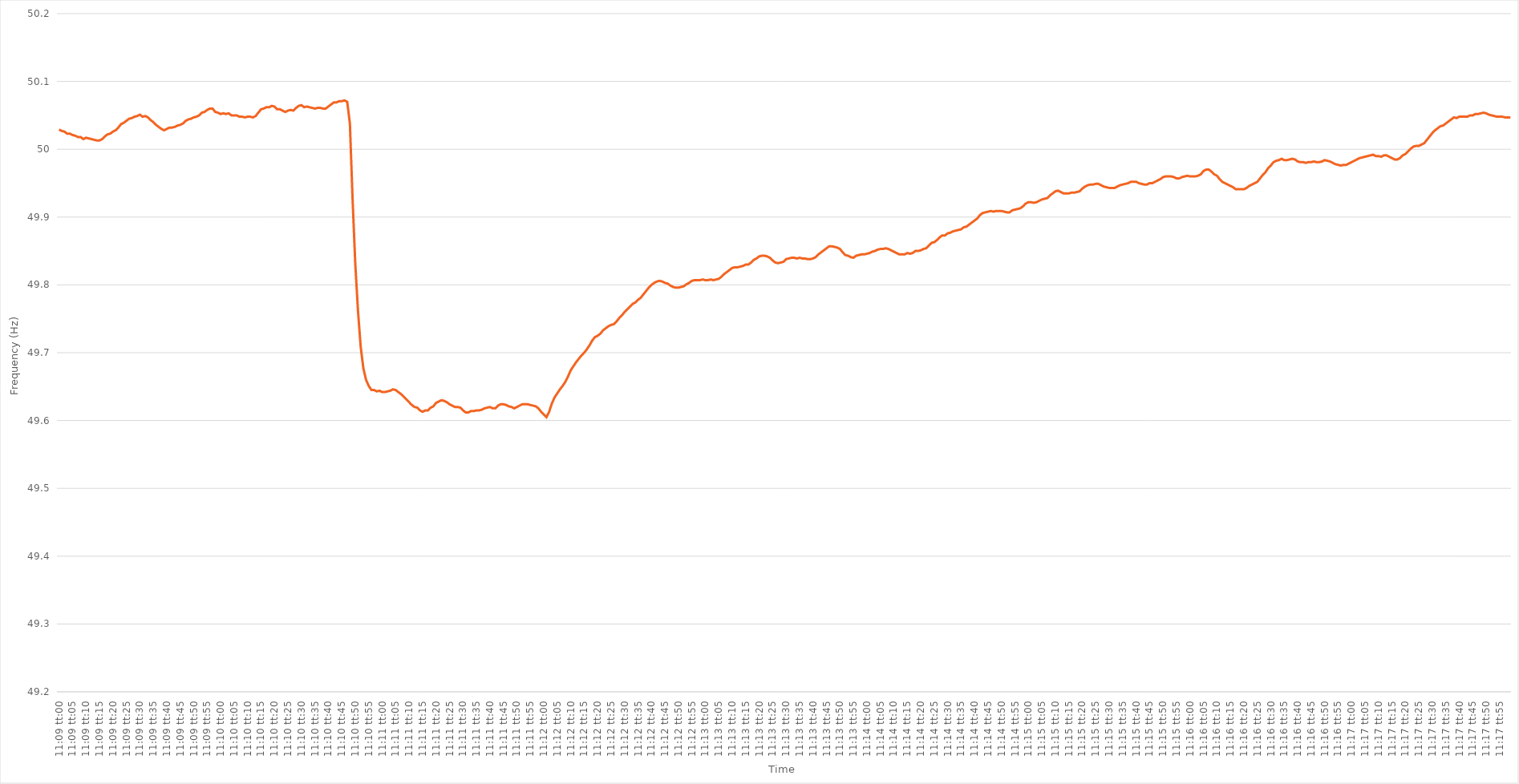
| Category | Series 0 |
|---|---|
| 0.46458333333333335 | 50.029 |
| 0.4645949074074074 | 50.027 |
| 0.4646064814814815 | 50.026 |
| 0.4646180555555555 | 50.023 |
| 0.46462962962962967 | 50.023 |
| 0.4646412037037037 | 50.021 |
| 0.4646527777777778 | 50.02 |
| 0.46466435185185184 | 50.018 |
| 0.46467592592592594 | 50.018 |
| 0.4646875 | 50.015 |
| 0.4646990740740741 | 50.017 |
| 0.46471064814814816 | 50.016 |
| 0.4647222222222222 | 50.015 |
| 0.4647337962962963 | 50.014 |
| 0.46474537037037034 | 50.013 |
| 0.46475694444444443 | 50.013 |
| 0.46476851851851847 | 50.015 |
| 0.4647800925925926 | 50.019 |
| 0.46479166666666666 | 50.022 |
| 0.46480324074074075 | 50.023 |
| 0.4648148148148148 | 50.026 |
| 0.4648263888888889 | 50.028 |
| 0.4648379629629629 | 50.032 |
| 0.4648495370370371 | 50.037 |
| 0.4648611111111111 | 50.039 |
| 0.4648726851851852 | 50.042 |
| 0.46488425925925925 | 50.045 |
| 0.46489583333333334 | 50.046 |
| 0.4649074074074074 | 50.048 |
| 0.46491898148148153 | 50.049 |
| 0.46493055555555557 | 50.051 |
| 0.46494212962962966 | 50.048 |
| 0.4649537037037037 | 50.049 |
| 0.4649652777777778 | 50.047 |
| 0.46497685185185184 | 50.043 |
| 0.4649884259259259 | 50.04 |
| 0.465 | 50.036 |
| 0.46501157407407406 | 50.033 |
| 0.46502314814814816 | 50.03 |
| 0.4650347222222222 | 50.028 |
| 0.4650462962962963 | 50.03 |
| 0.46505787037037033 | 50.032 |
| 0.4650694444444445 | 50.032 |
| 0.4650810185185185 | 50.033 |
| 0.4650925925925926 | 50.035 |
| 0.46510416666666665 | 50.036 |
| 0.46511574074074075 | 50.038 |
| 0.4651273148148148 | 50.042 |
| 0.46513888888888894 | 50.044 |
| 0.465150462962963 | 50.045 |
| 0.46516203703703707 | 50.047 |
| 0.4651736111111111 | 50.048 |
| 0.4651851851851852 | 50.05 |
| 0.46519675925925924 | 50.054 |
| 0.4652083333333333 | 50.055 |
| 0.46521990740740743 | 50.058 |
| 0.46523148148148147 | 50.06 |
| 0.46524305555555556 | 50.06 |
| 0.4652546296296296 | 50.055 |
| 0.4652662037037037 | 50.054 |
| 0.46527777777777773 | 50.052 |
| 0.4652893518518519 | 50.053 |
| 0.4653009259259259 | 50.052 |
| 0.4653125 | 50.053 |
| 0.46532407407407406 | 50.05 |
| 0.46533564814814815 | 50.05 |
| 0.4653472222222222 | 50.05 |
| 0.46535879629629634 | 50.048 |
| 0.4653703703703704 | 50.048 |
| 0.4653819444444445 | 50.047 |
| 0.4653935185185185 | 50.048 |
| 0.4654050925925926 | 50.048 |
| 0.46541666666666665 | 50.047 |
| 0.4654282407407408 | 50.049 |
| 0.46543981481481483 | 50.054 |
| 0.4654513888888889 | 50.059 |
| 0.46546296296296297 | 50.06 |
| 0.465474537037037 | 50.062 |
| 0.4654861111111111 | 50.062 |
| 0.46549768518518514 | 50.064 |
| 0.4655092592592593 | 50.063 |
| 0.46552083333333333 | 50.059 |
| 0.4655324074074074 | 50.059 |
| 0.46554398148148146 | 50.057 |
| 0.46555555555555556 | 50.055 |
| 0.4655671296296296 | 50.057 |
| 0.46557870370370374 | 50.058 |
| 0.4655902777777778 | 50.057 |
| 0.4656018518518519 | 50.061 |
| 0.4656134259259259 | 50.064 |
| 0.465625 | 50.065 |
| 0.46563657407407405 | 50.062 |
| 0.4656481481481482 | 50.063 |
| 0.46565972222222224 | 50.062 |
| 0.46567129629629633 | 50.061 |
| 0.46568287037037037 | 50.06 |
| 0.4656944444444444 | 50.061 |
| 0.4657060185185185 | 50.061 |
| 0.46571759259259254 | 50.06 |
| 0.4657291666666667 | 50.06 |
| 0.46574074074074073 | 50.063 |
| 0.4657523148148148 | 50.066 |
| 0.46576388888888887 | 50.069 |
| 0.46577546296296296 | 50.069 |
| 0.465787037037037 | 50.071 |
| 0.46579861111111115 | 50.071 |
| 0.4658101851851852 | 50.072 |
| 0.4658217592592593 | 50.07 |
| 0.4658333333333333 | 50.038 |
| 0.4658449074074074 | 49.926 |
| 0.46585648148148145 | 49.831 |
| 0.4658680555555556 | 49.762 |
| 0.46587962962962964 | 49.709 |
| 0.46589120370370374 | 49.677 |
| 0.4659027777777778 | 49.66 |
| 0.4659143518518518 | 49.651 |
| 0.4659259259259259 | 49.645 |
| 0.46593749999999995 | 49.645 |
| 0.4659490740740741 | 49.643 |
| 0.46596064814814814 | 49.644 |
| 0.46597222222222223 | 49.642 |
| 0.46598379629629627 | 49.642 |
| 0.46599537037037037 | 49.643 |
| 0.4660069444444444 | 49.644 |
| 0.46601851851851855 | 49.646 |
| 0.4660300925925926 | 49.645 |
| 0.4660416666666667 | 49.642 |
| 0.4660532407407407 | 49.639 |
| 0.4660648148148148 | 49.635 |
| 0.46607638888888886 | 49.631 |
| 0.466087962962963 | 49.627 |
| 0.46609953703703705 | 49.623 |
| 0.46611111111111114 | 49.62 |
| 0.4661226851851852 | 49.619 |
| 0.4661342592592593 | 49.615 |
| 0.4661458333333333 | 49.613 |
| 0.46615740740740735 | 49.615 |
| 0.4661689814814815 | 49.615 |
| 0.46618055555555554 | 49.619 |
| 0.46619212962962964 | 49.621 |
| 0.4662037037037037 | 49.626 |
| 0.46621527777777777 | 49.628 |
| 0.4662268518518518 | 49.63 |
| 0.46623842592592596 | 49.629 |
| 0.46625 | 49.627 |
| 0.4662615740740741 | 49.624 |
| 0.46627314814814813 | 49.622 |
| 0.4662847222222222 | 49.62 |
| 0.46629629629629626 | 49.62 |
| 0.4663078703703704 | 49.619 |
| 0.46631944444444445 | 49.615 |
| 0.46633101851851855 | 49.612 |
| 0.4663425925925926 | 49.612 |
| 0.4663541666666667 | 49.614 |
| 0.4663657407407407 | 49.614 |
| 0.46637731481481487 | 49.615 |
| 0.4663888888888889 | 49.615 |
| 0.46640046296296295 | 49.616 |
| 0.46641203703703704 | 49.618 |
| 0.4664236111111111 | 49.619 |
| 0.4664351851851852 | 49.62 |
| 0.4664467592592592 | 49.618 |
| 0.46645833333333336 | 49.618 |
| 0.4664699074074074 | 49.622 |
| 0.4664814814814815 | 49.624 |
| 0.46649305555555554 | 49.624 |
| 0.46650462962962963 | 49.623 |
| 0.46651620370370367 | 49.621 |
| 0.4665277777777778 | 49.62 |
| 0.46653935185185186 | 49.618 |
| 0.46655092592592595 | 49.62 |
| 0.4665625 | 49.622 |
| 0.4665740740740741 | 49.624 |
| 0.4665856481481481 | 49.624 |
| 0.4665972222222223 | 49.624 |
| 0.4666087962962963 | 49.623 |
| 0.46662037037037035 | 49.622 |
| 0.46663194444444445 | 49.621 |
| 0.4666435185185185 | 49.618 |
| 0.4666550925925926 | 49.613 |
| 0.4666666666666666 | 49.609 |
| 0.46667824074074077 | 49.605 |
| 0.4666898148148148 | 49.613 |
| 0.4667013888888889 | 49.625 |
| 0.46671296296296294 | 49.634 |
| 0.46672453703703703 | 49.64 |
| 0.4667361111111111 | 49.646 |
| 0.4667476851851852 | 49.651 |
| 0.46675925925925926 | 49.657 |
| 0.46677083333333336 | 49.665 |
| 0.4667824074074074 | 49.674 |
| 0.4667939814814815 | 49.68 |
| 0.46680555555555553 | 49.686 |
| 0.4668171296296297 | 49.691 |
| 0.4668287037037037 | 49.696 |
| 0.4668402777777778 | 49.7 |
| 0.46685185185185185 | 49.705 |
| 0.4668634259259259 | 49.711 |
| 0.466875 | 49.718 |
| 0.466886574074074 | 49.723 |
| 0.4668981481481482 | 49.725 |
| 0.4669097222222222 | 49.728 |
| 0.4669212962962963 | 49.733 |
| 0.46693287037037035 | 49.736 |
| 0.46694444444444444 | 49.739 |
| 0.4669560185185185 | 49.741 |
| 0.46696759259259263 | 49.742 |
| 0.46697916666666667 | 49.746 |
| 0.46699074074074076 | 49.751 |
| 0.4670023148148148 | 49.755 |
| 0.4670138888888889 | 49.76 |
| 0.46702546296296293 | 49.764 |
| 0.4670370370370371 | 49.768 |
| 0.4670486111111111 | 49.772 |
| 0.4670601851851852 | 49.774 |
| 0.46707175925925926 | 49.778 |
| 0.46708333333333335 | 49.781 |
| 0.4670949074074074 | 49.786 |
| 0.46710648148148143 | 49.791 |
| 0.4671180555555556 | 49.796 |
| 0.4671296296296296 | 49.8 |
| 0.4671412037037037 | 49.803 |
| 0.46715277777777775 | 49.805 |
| 0.46716435185185184 | 49.806 |
| 0.4671759259259259 | 49.805 |
| 0.46718750000000003 | 49.803 |
| 0.46719907407407407 | 49.802 |
| 0.46721064814814817 | 49.799 |
| 0.4672222222222222 | 49.797 |
| 0.4672337962962963 | 49.796 |
| 0.46724537037037034 | 49.796 |
| 0.4672569444444445 | 49.797 |
| 0.4672685185185185 | 49.798 |
| 0.4672800925925926 | 49.801 |
| 0.46729166666666666 | 49.803 |
| 0.46730324074074076 | 49.806 |
| 0.4673148148148148 | 49.807 |
| 0.46732638888888883 | 49.807 |
| 0.467337962962963 | 49.807 |
| 0.467349537037037 | 49.808 |
| 0.4673611111111111 | 49.807 |
| 0.46737268518518515 | 49.807 |
| 0.46738425925925925 | 49.808 |
| 0.4673958333333333 | 49.807 |
| 0.46740740740740744 | 49.808 |
| 0.4674189814814815 | 49.809 |
| 0.46743055555555557 | 49.812 |
| 0.4674421296296296 | 49.816 |
| 0.4674537037037037 | 49.819 |
| 0.46746527777777774 | 49.822 |
| 0.4674768518518519 | 49.825 |
| 0.46748842592592593 | 49.826 |
| 0.4675 | 49.826 |
| 0.46751157407407407 | 49.827 |
| 0.46752314814814816 | 49.828 |
| 0.4675347222222222 | 49.83 |
| 0.46754629629629635 | 49.83 |
| 0.4675578703703704 | 49.833 |
| 0.4675694444444445 | 49.837 |
| 0.4675810185185185 | 49.839 |
| 0.46759259259259256 | 49.842 |
| 0.46760416666666665 | 49.843 |
| 0.4676157407407407 | 49.843 |
| 0.46762731481481484 | 49.842 |
| 0.4676388888888889 | 49.84 |
| 0.467650462962963 | 49.836 |
| 0.467662037037037 | 49.833 |
| 0.4676736111111111 | 49.832 |
| 0.46768518518518515 | 49.833 |
| 0.4676967592592593 | 49.834 |
| 0.46770833333333334 | 49.838 |
| 0.46771990740740743 | 49.839 |
| 0.46773148148148147 | 49.84 |
| 0.46774305555555556 | 49.84 |
| 0.4677546296296296 | 49.839 |
| 0.46776620370370375 | 49.84 |
| 0.4677777777777778 | 49.839 |
| 0.4677893518518519 | 49.839 |
| 0.4678009259259259 | 49.838 |
| 0.46781249999999996 | 49.838 |
| 0.46782407407407406 | 49.839 |
| 0.4678356481481481 | 49.841 |
| 0.46784722222222225 | 49.845 |
| 0.4678587962962963 | 49.848 |
| 0.4678703703703704 | 49.851 |
| 0.4678819444444444 | 49.854 |
| 0.4678935185185185 | 49.857 |
| 0.46790509259259255 | 49.857 |
| 0.4679166666666667 | 49.856 |
| 0.46792824074074074 | 49.855 |
| 0.46793981481481484 | 49.853 |
| 0.4679513888888889 | 49.848 |
| 0.46796296296296297 | 49.844 |
| 0.467974537037037 | 49.843 |
| 0.46798611111111116 | 49.841 |
| 0.4679976851851852 | 49.84 |
| 0.4680092592592593 | 49.843 |
| 0.46802083333333333 | 49.844 |
| 0.4680324074074074 | 49.845 |
| 0.46804398148148146 | 49.845 |
| 0.4680555555555555 | 49.846 |
| 0.46806712962962965 | 49.847 |
| 0.4680787037037037 | 49.849 |
| 0.4680902777777778 | 49.85 |
| 0.4681018518518518 | 49.852 |
| 0.4681134259259259 | 49.853 |
| 0.46812499999999996 | 49.853 |
| 0.4681365740740741 | 49.854 |
| 0.46814814814814815 | 49.853 |
| 0.46815972222222224 | 49.851 |
| 0.4681712962962963 | 49.849 |
| 0.4681828703703704 | 49.847 |
| 0.4681944444444444 | 49.845 |
| 0.46820601851851856 | 49.845 |
| 0.4682175925925926 | 49.845 |
| 0.4682291666666667 | 49.847 |
| 0.46824074074074074 | 49.846 |
| 0.46825231481481483 | 49.847 |
| 0.46826388888888887 | 49.85 |
| 0.468275462962963 | 49.85 |
| 0.46828703703703706 | 49.851 |
| 0.4682986111111111 | 49.853 |
| 0.4683101851851852 | 49.854 |
| 0.46832175925925923 | 49.858 |
| 0.4683333333333333 | 49.862 |
| 0.46834490740740736 | 49.863 |
| 0.4683564814814815 | 49.866 |
| 0.46836805555555555 | 49.87 |
| 0.46837962962962965 | 49.873 |
| 0.4683912037037037 | 49.873 |
| 0.4684027777777778 | 49.876 |
| 0.4684143518518518 | 49.877 |
| 0.46842592592592597 | 49.879 |
| 0.4684375 | 49.88 |
| 0.4684490740740741 | 49.881 |
| 0.46846064814814814 | 49.882 |
| 0.46847222222222223 | 49.885 |
| 0.4684837962962963 | 49.886 |
| 0.4684953703703704 | 49.889 |
| 0.46850694444444446 | 49.892 |
| 0.4685185185185185 | 49.895 |
| 0.4685300925925926 | 49.898 |
| 0.46854166666666663 | 49.903 |
| 0.46855324074074073 | 49.906 |
| 0.46856481481481477 | 49.907 |
| 0.4685763888888889 | 49.908 |
| 0.46858796296296296 | 49.909 |
| 0.46859953703703705 | 49.908 |
| 0.4686111111111111 | 49.909 |
| 0.4686226851851852 | 49.909 |
| 0.4686342592592592 | 49.909 |
| 0.4686458333333334 | 49.908 |
| 0.4686574074074074 | 49.907 |
| 0.4686689814814815 | 49.907 |
| 0.46868055555555554 | 49.91 |
| 0.46869212962962964 | 49.911 |
| 0.4687037037037037 | 49.912 |
| 0.46871527777777783 | 49.913 |
| 0.46872685185185187 | 49.916 |
| 0.46873842592592596 | 49.92 |
| 0.46875 | 49.922 |
| 0.46876157407407404 | 49.922 |
| 0.46877314814814813 | 49.921 |
| 0.46878472222222217 | 49.922 |
| 0.4687962962962963 | 49.924 |
| 0.46880787037037036 | 49.926 |
| 0.46881944444444446 | 49.927 |
| 0.4688310185185185 | 49.928 |
| 0.4688425925925926 | 49.932 |
| 0.4688541666666666 | 49.935 |
| 0.4688657407407408 | 49.938 |
| 0.4688773148148148 | 49.939 |
| 0.4688888888888889 | 49.937 |
| 0.46890046296296295 | 49.935 |
| 0.46891203703703704 | 49.935 |
| 0.4689236111111111 | 49.935 |
| 0.46893518518518523 | 49.936 |
| 0.46894675925925927 | 49.936 |
| 0.46895833333333337 | 49.937 |
| 0.4689699074074074 | 49.938 |
| 0.4689814814814815 | 49.942 |
| 0.46899305555555554 | 49.945 |
| 0.4690046296296296 | 49.947 |
| 0.4690162037037037 | 49.948 |
| 0.46902777777777777 | 49.948 |
| 0.46903935185185186 | 49.949 |
| 0.4690509259259259 | 49.949 |
| 0.4690625 | 49.947 |
| 0.46907407407407403 | 49.945 |
| 0.4690856481481482 | 49.944 |
| 0.4690972222222222 | 49.943 |
| 0.4691087962962963 | 49.943 |
| 0.46912037037037035 | 49.943 |
| 0.46913194444444445 | 49.945 |
| 0.4691435185185185 | 49.947 |
| 0.46915509259259264 | 49.948 |
| 0.4691666666666667 | 49.949 |
| 0.46917824074074077 | 49.95 |
| 0.4691898148148148 | 49.952 |
| 0.4692013888888889 | 49.952 |
| 0.46921296296296294 | 49.952 |
| 0.469224537037037 | 49.95 |
| 0.46923611111111113 | 49.949 |
| 0.46924768518518517 | 49.948 |
| 0.46925925925925926 | 49.948 |
| 0.4692708333333333 | 49.95 |
| 0.4692824074074074 | 49.95 |
| 0.46929398148148144 | 49.952 |
| 0.4693055555555556 | 49.954 |
| 0.4693171296296296 | 49.956 |
| 0.4693287037037037 | 49.959 |
| 0.46934027777777776 | 49.96 |
| 0.46935185185185185 | 49.96 |
| 0.4693634259259259 | 49.96 |
| 0.46937500000000004 | 49.959 |
| 0.4693865740740741 | 49.957 |
| 0.4693981481481482 | 49.957 |
| 0.4694097222222222 | 49.959 |
| 0.4694212962962963 | 49.96 |
| 0.46943287037037035 | 49.961 |
| 0.4694444444444445 | 49.96 |
| 0.46945601851851854 | 49.96 |
| 0.46946759259259263 | 49.96 |
| 0.46947916666666667 | 49.961 |
| 0.4694907407407407 | 49.963 |
| 0.4695023148148148 | 49.968 |
| 0.46951388888888884 | 49.97 |
| 0.469525462962963 | 49.97 |
| 0.46953703703703703 | 49.967 |
| 0.4695486111111111 | 49.963 |
| 0.46956018518518516 | 49.961 |
| 0.46957175925925926 | 49.956 |
| 0.4695833333333333 | 49.952 |
| 0.46959490740740745 | 49.95 |
| 0.4696064814814815 | 49.948 |
| 0.4696180555555556 | 49.946 |
| 0.4696296296296296 | 49.944 |
| 0.4696412037037037 | 49.941 |
| 0.46965277777777775 | 49.941 |
| 0.4696643518518519 | 49.941 |
| 0.46967592592592594 | 49.941 |
| 0.46968750000000004 | 49.943 |
| 0.4696990740740741 | 49.946 |
| 0.4697106481481481 | 49.948 |
| 0.4697222222222222 | 49.95 |
| 0.46973379629629625 | 49.952 |
| 0.4697453703703704 | 49.957 |
| 0.46975694444444444 | 49.962 |
| 0.46976851851851853 | 49.966 |
| 0.46978009259259257 | 49.972 |
| 0.46979166666666666 | 49.976 |
| 0.4698032407407407 | 49.981 |
| 0.46981481481481485 | 49.983 |
| 0.4698263888888889 | 49.984 |
| 0.469837962962963 | 49.986 |
| 0.469849537037037 | 49.984 |
| 0.4698611111111111 | 49.984 |
| 0.46987268518518516 | 49.985 |
| 0.4698842592592593 | 49.986 |
| 0.46989583333333335 | 49.985 |
| 0.46990740740740744 | 49.982 |
| 0.4699189814814815 | 49.981 |
| 0.4699305555555555 | 49.981 |
| 0.4699421296296296 | 49.98 |
| 0.46995370370370365 | 49.981 |
| 0.4699652777777778 | 49.981 |
| 0.46997685185185184 | 49.982 |
| 0.46998842592592593 | 49.981 |
| 0.47 | 49.981 |
| 0.47001157407407407 | 49.982 |
| 0.4700231481481481 | 49.984 |
| 0.47003472222222226 | 49.983 |
| 0.4700462962962963 | 49.982 |
| 0.4700578703703704 | 49.98 |
| 0.47006944444444443 | 49.978 |
| 0.4700810185185185 | 49.977 |
| 0.47009259259259256 | 49.976 |
| 0.4701041666666667 | 49.977 |
| 0.47011574074074075 | 49.977 |
| 0.47012731481481485 | 49.979 |
| 0.4701388888888889 | 49.981 |
| 0.470150462962963 | 49.983 |
| 0.470162037037037 | 49.985 |
| 0.47017361111111117 | 49.987 |
| 0.4701851851851852 | 49.988 |
| 0.47019675925925924 | 49.989 |
| 0.47020833333333334 | 49.99 |
| 0.4702199074074074 | 49.991 |
| 0.4702314814814815 | 49.992 |
| 0.4702430555555555 | 49.99 |
| 0.47025462962962966 | 49.99 |
| 0.4702662037037037 | 49.989 |
| 0.4702777777777778 | 49.991 |
| 0.47028935185185183 | 49.991 |
| 0.47030092592592593 | 49.989 |
| 0.47031249999999997 | 49.987 |
| 0.4703240740740741 | 49.985 |
| 0.47033564814814816 | 49.985 |
| 0.47034722222222225 | 49.987 |
| 0.4703587962962963 | 49.991 |
| 0.4703703703703704 | 49.993 |
| 0.4703819444444444 | 49.997 |
| 0.47039351851851857 | 50.001 |
| 0.4704050925925926 | 50.004 |
| 0.47041666666666665 | 50.005 |
| 0.47042824074074074 | 50.005 |
| 0.4704398148148148 | 50.007 |
| 0.4704513888888889 | 50.009 |
| 0.4704629629629629 | 50.014 |
| 0.47047453703703707 | 50.019 |
| 0.4704861111111111 | 50.024 |
| 0.4704976851851852 | 50.028 |
| 0.47050925925925924 | 50.031 |
| 0.47052083333333333 | 50.034 |
| 0.47053240740740737 | 50.035 |
| 0.4705439814814815 | 50.038 |
| 0.47055555555555556 | 50.041 |
| 0.47056712962962965 | 50.044 |
| 0.4705787037037037 | 50.047 |
| 0.4705902777777778 | 50.046 |
| 0.4706018518518518 | 50.048 |
| 0.470613425925926 | 50.048 |
| 0.470625 | 50.048 |
| 0.47063657407407405 | 50.048 |
| 0.47064814814814815 | 50.05 |
| 0.4706597222222222 | 50.05 |
| 0.4706712962962963 | 50.052 |
| 0.4706828703703703 | 50.052 |
| 0.47069444444444447 | 50.053 |
| 0.4707060185185185 | 50.054 |
| 0.4707175925925926 | 50.053 |
| 0.47072916666666664 | 50.051 |
| 0.47074074074074074 | 50.05 |
| 0.4707523148148148 | 50.049 |
| 0.4707638888888889 | 50.048 |
| 0.47077546296296297 | 50.048 |
| 0.47078703703703706 | 50.048 |
| 0.4707986111111111 | 50.047 |
| 0.4708101851851852 | 50.047 |
| 0.47082175925925923 | 50.047 |